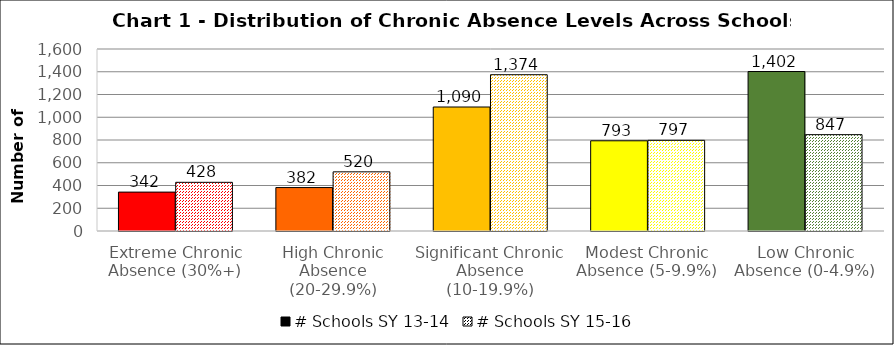
| Category | # Schools SY 13-14 | # Schools SY 15-16 |
|---|---|---|
| Extreme Chronic Absence (30%+) | 342 | 428 |
| High Chronic Absence (20-29.9%) | 382 | 520 |
| Significant Chronic Absence (10-19.9%) | 1090 | 1374 |
| Modest Chronic Absence (5-9.9%) | 793 | 797 |
| Low Chronic Absence (0-4.9%) | 1402 | 847 |